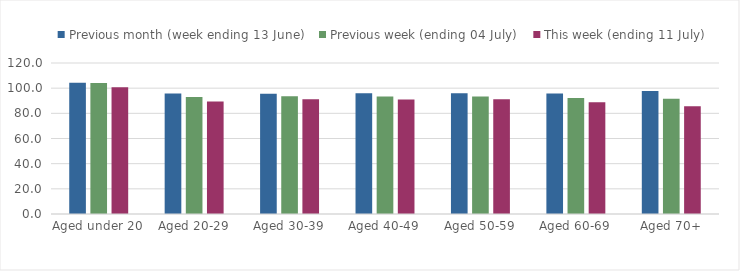
| Category | Previous month (week ending 13 June) | Previous week (ending 04 July) | This week (ending 11 July) |
|---|---|---|---|
| Aged under 20 | 104.225 | 104.071 | 100.649 |
| Aged 20-29 | 95.683 | 93.028 | 89.422 |
| Aged 30-39 | 95.608 | 93.615 | 91.122 |
| Aged 40-49 | 95.899 | 93.398 | 91.004 |
| Aged 50-59 | 95.936 | 93.424 | 91.161 |
| Aged 60-69 | 95.744 | 92.138 | 88.764 |
| Aged 70+ | 97.801 | 91.66 | 85.621 |